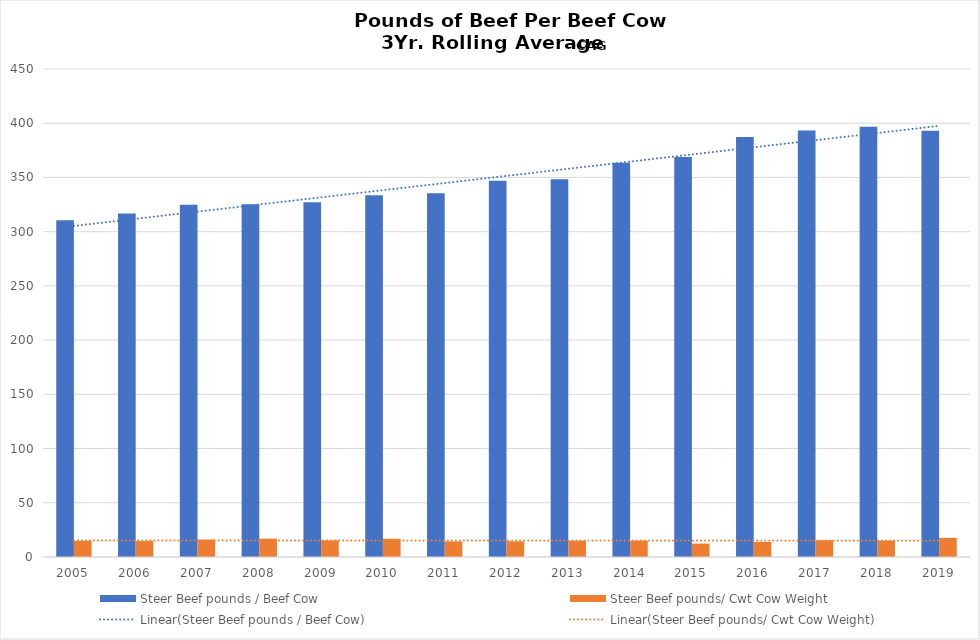
| Category | Steer Beef pounds / Beef Cow | Steer Beef pounds/ Cwt Cow Weight |
|---|---|---|
| 2005.0 | 310.523 | 14.743 |
| 2006.0 | 316.807 | 14.67 |
| 2007.0 | 324.832 | 16.047 |
| 2008.0 | 325.208 | 16.952 |
| 2009.0 | 327.239 | 15.369 |
| 2010.0 | 333.522 | 16.818 |
| 2011.0 | 335.315 | 14.403 |
| 2012.0 | 346.952 | 14.485 |
| 2013.0 | 348.302 | 14.896 |
| 2014.0 | 363.645 | 15.095 |
| 2015.0 | 368.814 | 12.389 |
| 2016.0 | 387.221 | 13.831 |
| 2017.0 | 393.303 | 15.442 |
| 2018.0 | 396.657 | 15.061 |
| 2019.0 | 393.112 | 17.626 |